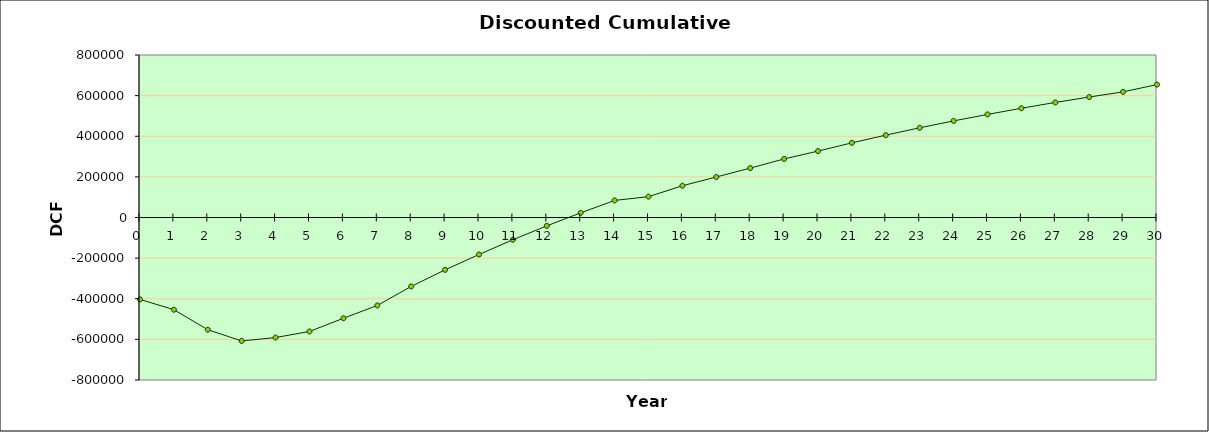
| Category | Discounted accumulative cash flow ($) |
|---|---|
| 0.0 | -403290 |
| 1.0 | -453857.18 |
| 2.0 | -552533.374 |
| 3.0 | -607729.211 |
| 4.0 | -590946.548 |
| 5.0 | -561001.317 |
| 6.0 | -496125.235 |
| 7.0 | -433111.006 |
| 8.0 | -339382.974 |
| 9.0 | -257727.478 |
| 10.0 | -182172.062 |
| 11.0 | -109498.961 |
| 12.0 | -41237.613 |
| 13.0 | 22972.349 |
| 14.0 | 83990.086 |
| 15.0 | 102602.295 |
| 16.0 | 156278.03 |
| 17.0 | 199488.227 |
| 18.0 | 243090.349 |
| 19.0 | 288355.838 |
| 20.0 | 326918.364 |
| 21.0 | 367498.644 |
| 22.0 | 405504.422 |
| 23.0 | 441620.726 |
| 24.0 | 475544.525 |
| 25.0 | 507454.909 |
| 26.0 | 537778.855 |
| 27.0 | 566386.351 |
| 28.0 | 593061.547 |
| 29.0 | 618522.116 |
| 30.0 | 654375.787 |